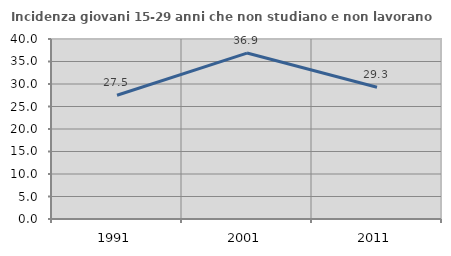
| Category | Incidenza giovani 15-29 anni che non studiano e non lavorano  |
|---|---|
| 1991.0 | 27.493 |
| 2001.0 | 36.873 |
| 2011.0 | 29.28 |